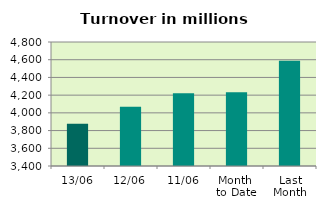
| Category | Series 0 |
|---|---|
| 13/06 | 3875.781 |
| 12/06 | 4069.006 |
| 11/06 | 4221.112 |
| Month 
to Date | 4231.686 |
| Last
Month | 4586.899 |